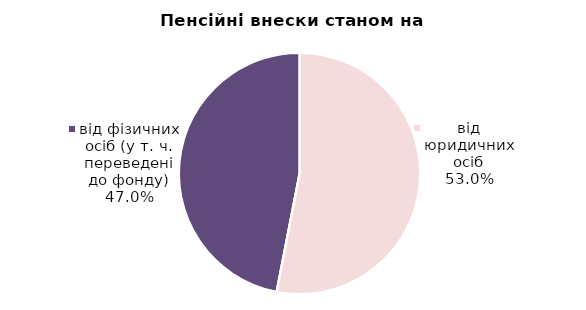
| Category | Series 0 |
|---|---|
| від юридичних осіб | 940.709 |
| від ФОПів | 0.324 |
| від фізичних осіб (у т. ч. переведені до фонду) | 832.659 |